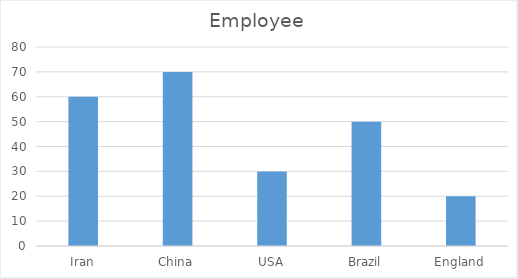
| Category | Employee |
|---|---|
| Iran | 60 |
| China | 70 |
| USA | 30 |
| Brazil | 50 |
| England | 20 |